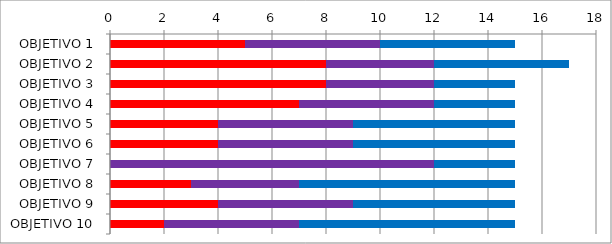
| Category | Series 0 | Series 3 | Series 1 |
|---|---|---|---|
| OBJETIVO 1 | 5 | 5 | 5 |
| OBJETIVO 2 | 8 | 4 | 5 |
| OBJETIVO 3 | 8 | 4 | 3 |
| OBJETIVO 4 | 7 | 5 | 3 |
| OBJETIVO 5 | 4 | 5 | 6 |
| OBJETIVO 6 | 4 | 5 | 6 |
| OBJETIVO 7 | 0 | 12 | 3 |
| OBJETIVO 8 | 3 | 4 | 8 |
| OBJETIVO 9 | 4 | 5 | 6 |
| OBJETIVO 10 | 2 | 5 | 8 |